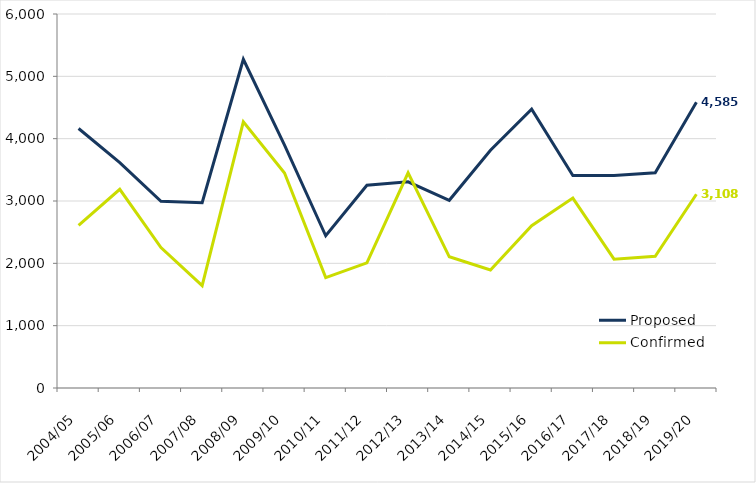
| Category | Proposed | Confirmed |
|---|---|---|
| 2004/05 | 4163 | 2608 |
| 2005/06 | 3616 | 3187 |
| 2006/07 | 2994 | 2253 |
| 2007/08 | 2972 | 1643 |
| 2008/09 | 5274 | 4269 |
| 2009/10 | 3896 | 3449 |
| 2010/11 | 2442 | 1772 |
| 2011/12 | 3252 | 2008 |
| 2012/13 | 3308 | 3452 |
| 2013/14 | 3011 | 2105 |
| 2014/15 | 3814 | 1893 |
| 2015/16 | 4473 | 2603 |
| 2016/17 | 3408 | 3047 |
| 2017/18 | 3411 | 2067 |
| 2018/19 | 3452 | 2112 |
| 2019/20 | 4585 | 3108 |